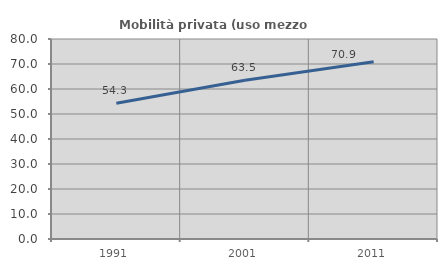
| Category | Mobilità privata (uso mezzo privato) |
|---|---|
| 1991.0 | 54.3 |
| 2001.0 | 63.535 |
| 2011.0 | 70.857 |